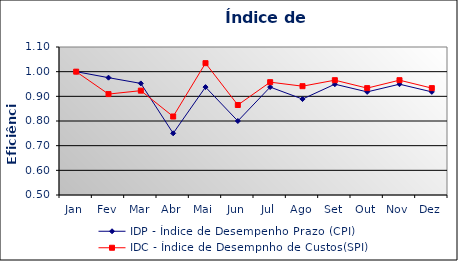
| Category | IDP - Índice de Desempenho Prazo (CPI) | IDC - Índice de Desempnho de Custos(SPI) |
|---|---|---|
| Jan | 1 | 1 |
| Fev | 0.976 | 0.909 |
| Mar | 0.952 | 0.923 |
| Abr | 0.75 | 0.818 |
| Mai | 0.938 | 1.034 |
| Jun | 0.8 | 0.865 |
| Jul | 0.938 | 0.957 |
| Ago | 0.889 | 0.941 |
| Set | 0.949 | 0.966 |
| Out | 0.918 | 0.933 |
| Nov | 0.949 | 0.966 |
| Dez | 0.918 | 0.933 |